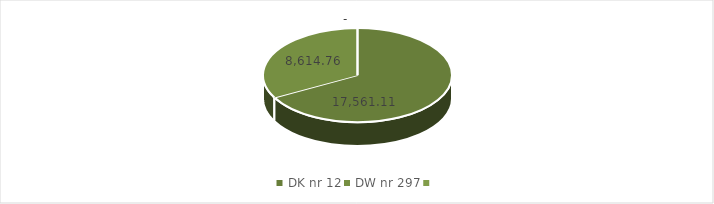
| Category | Series 1 | Series 2 | Series 0 |
|---|---|---|---|
| DK nr 12 | 17561.113 |  |  |
| DW nr 297 | 8614.764 |  |  |